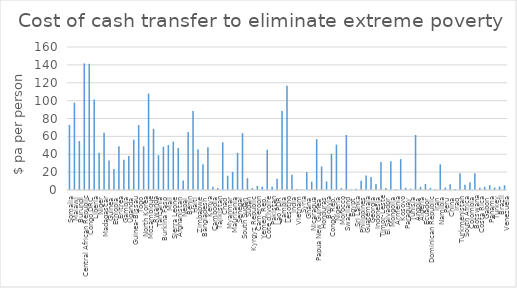
| Category | cash transfer |
|---|---|
| Somalia | 72.881 |
| Malawi | 97.784 |
| Burundi | 54.744 |
| Central African Republic | 141.608 |
| Congo DRC | 141.146 |
| Liberia | 101.276 |
| Niger | 41.649 |
| Madagascar | 64.034 |
| Guinea | 32.949 |
| Ethiopia | 23.472 |
| Eritrea | 48.909 |
| Gambia | 33.732 |
| Uganda | 37.975 |
| Guinea-Bissau | 56.335 |
| Togo | 72.684 |
| North Korea | 48.909 |
| Mozambique | 107.859 |
| Rwanda | 68.465 |
| Tanzania | 38.829 |
| Burkina Faso | 48.4 |
| Mali | 50.18 |
| Sierra Leone | 54.191 |
| Afghanistan | 46.953 |
| Nepal | 10.696 |
| Benin | 64.873 |
| Haiti | 88.488 |
| Zimbabwe | 45.656 |
| Bangladesh | 28.879 |
| Kenya | 47.859 |
| Cambodia | 3.525 |
| Tajikistan | 2.347 |
| Chad | 53.44 |
| Myanmar | 16.048 |
| Mauritania | 20.269 |
| Senegal | 41.613 |
| South Sudan | 63.592 |
| Sudan | 13.201 |
| Kyrgyz Republic | 2.202 |
| Cameroon | 4.641 |
| Yemen, Rep. | 3.707 |
| Côte d'Ivoire | 45.154 |
| Pakistan | 3.52 |
| Lao PDR | 12.641 |
| Zambia | 88.403 |
| Lesotho | 116.693 |
| India | 17.053 |
| Vietnam | 1.13 |
| Syria | 0.613 |
| Ghana | 20.135 |
| Nicaragua | 9.265 |
| Papua New Guinea | 56.807 |
| Honduras | 26.186 |
| Bolivia | 9.586 |
| Congo, Rep. | 40.527 |
| Nigeria | 50.735 |
| Morocco | 2.008 |
| Swaziland | 61.502 |
| Egypt | 0.568 |
| Sri Lanka | 1.415 |
| Philippines | 10.287 |
| Guatemala | 16.218 |
| Georgia | 14.42 |
| Indonesia | 6.608 |
| Timor-Leste | 31.333 |
| El Salvador | 2.336 |
| Mongolia | 32.203 |
| Armenia | 0.974 |
| Kosovo | 34.602 |
| Paraguay | 2.42 |
| Tunisia | 1.523 |
| Angola | 61.571 |
| Algeria | 3.503 |
| Ecuador | 6.641 |
| Dominican Republic | 2.348 |
| Iran | 0.722 |
| Namibia | 28.712 |
| Peru | 2.884 |
| China | 6.461 |
| Iraq | 1.116 |
| Turkmenistan | 18.723 |
| South Africa | 5.954 |
| Colombia | 8.715 |
| Botswana | 18.726 |
| Costa Rica | 2.581 |
| Gabon | 3.428 |
| Panama | 5.396 |
| Turkey | 2.764 |
| Brazil | 3.932 |
| Venezuela | 5.32 |